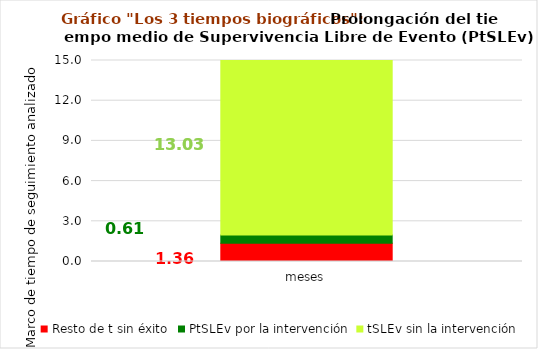
| Category | Resto de t sin éxito | PtSLEv por la intervención | tSLEv sin la intervención |
|---|---|---|---|
| meses | 1.361 | 0.609 | 13.03 |